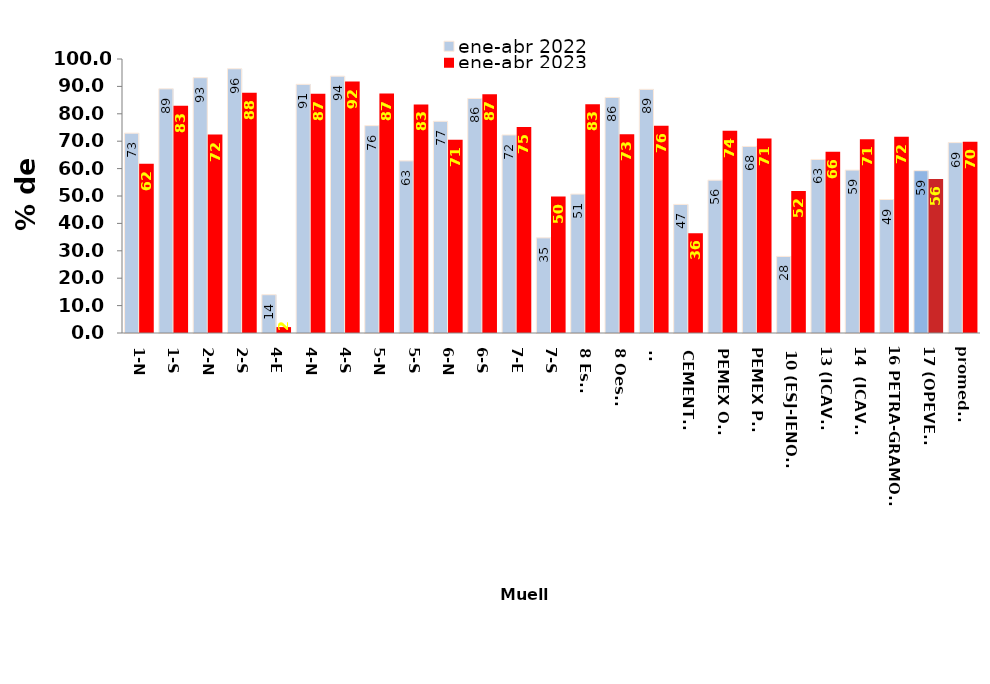
| Category | ene-abr 2022 | ene-abr 2023 |
|---|---|---|
| 1-N | 72.935 | 61.815 |
| 1-S | 89.116 | 82.908 |
| 2-N | 93.168 | 72.437 |
| 2-S | 96.439 | 87.722 |
| 4-E | 13.974 | 2.157 |
| 4-N | 90.745 | 87.349 |
| 4-S | 93.749 | 91.765 |
| 5-N | 75.673 | 87.39 |
| 5-S | 62.821 | 83.421 |
| 6-N | 77.258 | 70.526 |
| 6-S | 85.591 | 87.176 |
| 7-E | 72.285 | 75.183 |
| 7-S | 34.722 | 49.814 |
| 8 Este | 50.691 | 83.468 |
| 8 Oeste | 85.952 | 72.523 |
| 9- | 88.923 | 75.636 |
| CEMENTOS | 46.925 | 36.413 |
| PEMEX OTE | 55.778 | 73.827 |
| PEMEX PTE | 68.075 | 70.942 |
| 10 (ESJ-IENOVA) | 27.942 | 51.798 |
| 13 (ICAVE) | 63.331 | 66.193 |
| 14  (ICAVE) | 59.453 | 70.731 |
| 16 PETRA-GRAMOSA | 48.715 | 71.6 |
| 17 (OPEVER) | 59.233 | 56.227 |
| promedio | 69.483 | 69.797 |